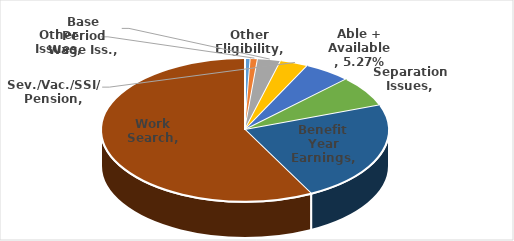
| Category | Series 0 |
|---|---|
| Other Eligibility | 0.006 |
| Other Issues | 0.008 |
| Base Period Wage Iss. | 0.026 |
| Sev./Vac./SSI/ Pension | 0.032 |
| Able + Available | 0.053 |
| Separation Issues | 0.069 |
| Benefit Year Earnings | 0.23 |
| Work Search | 0.576 |